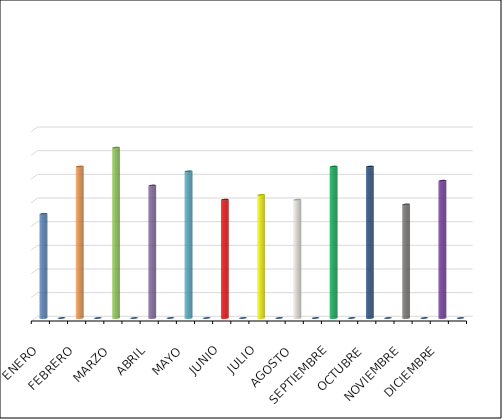
| Category | Series 0 |
|---|---|
| ENERO | 22 |
|  | 0 |
| FEBRERO | 32 |
|  | 0 |
| MARZO | 36 |
|  | 0 |
| ABRIL | 28 |
|  | 0 |
| MAYO | 31 |
|  | 0 |
| JUNIO | 25 |
|  | 0 |
| JULIO | 26 |
|  | 0 |
| AGOSTO | 25 |
|  | 0 |
| SEPTIEMBRE | 32 |
|  | 0 |
| OCTUBRE | 32 |
|  | 0 |
| NOVIEMBRE | 24 |
|  | 0 |
| DICIEMBRE | 29 |